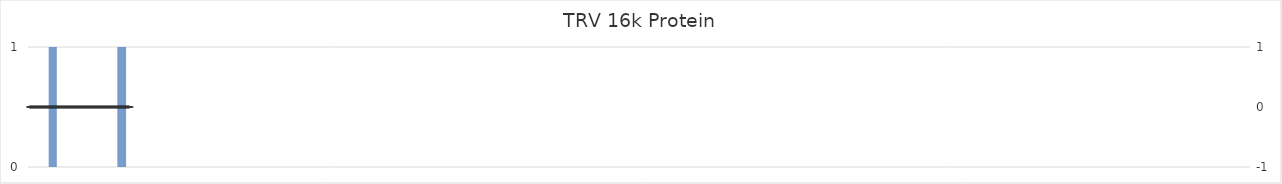
| Category | TRV 16k Protein |
|---|---|
| 1.0 | 0 |
| 2.0 | 0 |
| 3.0 | 0 |
| 4.0 | 0 |
| 5.0 | 0 |
| 6.0 | 0 |
| 7.0 | 0 |
| 8.0 | 0 |
| 9.0 | 0 |
| 10.0 | 0 |
| 11.0 | 0 |
| 12.0 | 0 |
| 13.0 | 0 |
| 14.0 | 0 |
| 15.0 | 0 |
| 16.0 | 0 |
| 17.0 | 0 |
| 18.0 | 0 |
| 19.0 | 0 |
| 20.0 | 0 |
| 21.0 | 0 |
| 22.0 | 0 |
| 23.0 | 0 |
| 24.0 | 0 |
| 25.0 | 0 |
| 26.0 | 0 |
| 27.0 | 0 |
| 28.0 | 0 |
| 29.0 | 0 |
| 30.0 | 1 |
| 31.0 | 1 |
| 32.0 | 1 |
| 33.0 | 1 |
| 34.0 | 1 |
| 35.0 | 1 |
| 36.0 | 1 |
| 37.0 | 1 |
| 38.0 | 1 |
| 39.0 | 1 |
| 40.0 | 1 |
| 41.0 | 0 |
| 42.0 | 0 |
| 43.0 | 0 |
| 44.0 | 0 |
| 45.0 | 0 |
| 46.0 | 0 |
| 47.0 | 0 |
| 48.0 | 0 |
| 49.0 | 0 |
| 50.0 | 0 |
| 51.0 | 0 |
| 52.0 | 0 |
| 53.0 | 0 |
| 54.0 | 0 |
| 55.0 | 0 |
| 56.0 | 0 |
| 57.0 | 0 |
| 58.0 | 0 |
| 59.0 | 0 |
| 60.0 | 0 |
| 61.0 | 0 |
| 62.0 | 0 |
| 63.0 | 0 |
| 64.0 | 0 |
| 65.0 | 0 |
| 66.0 | 0 |
| 67.0 | 0 |
| 68.0 | 0 |
| 69.0 | 0 |
| 70.0 | 0 |
| 71.0 | 0 |
| 72.0 | 0 |
| 73.0 | 0 |
| 74.0 | 0 |
| 75.0 | 0 |
| 76.0 | 0 |
| 77.0 | 0 |
| 78.0 | 0 |
| 79.0 | 0 |
| 80.0 | 0 |
| 81.0 | 0 |
| 82.0 | 0 |
| 83.0 | 0 |
| 84.0 | 0 |
| 85.0 | 0 |
| 86.0 | 0 |
| 87.0 | 0 |
| 88.0 | 0 |
| 89.0 | 0 |
| 90.0 | 0 |
| 91.0 | 0 |
| 92.0 | 0 |
| 93.0 | 0 |
| 94.0 | 0 |
| 95.0 | 0 |
| 96.0 | 0 |
| 97.0 | 0 |
| 98.0 | 0 |
| 99.0 | 0 |
| 100.0 | 0 |
| 101.0 | 0 |
| 102.0 | 0 |
| 103.0 | 0 |
| 104.0 | 0 |
| 105.0 | 0 |
| 106.0 | 0 |
| 107.0 | 0 |
| 108.0 | 0 |
| 109.0 | 0 |
| 110.0 | 0 |
| 111.0 | 0 |
| 112.0 | 0 |
| 113.0 | 0 |
| 114.0 | 0 |
| 115.0 | 0 |
| 116.0 | 0 |
| 117.0 | 0 |
| 118.0 | 0 |
| 119.0 | 0 |
| 120.0 | 0 |
| 121.0 | 0 |
| 122.0 | 0 |
| 123.0 | 0 |
| 124.0 | 0 |
| 125.0 | 0 |
| 126.0 | 1 |
| 127.0 | 1 |
| 128.0 | 1 |
| 129.0 | 1 |
| 130.0 | 1 |
| 131.0 | 1 |
| 132.0 | 1 |
| 133.0 | 1 |
| 134.0 | 1 |
| 135.0 | 1 |
| 136.0 | 1 |
| 137.0 | 1 |
| 138.0 | 0 |
| 139.0 | 0 |
| 140.0 | 0 |
| 141.0 | 0 |
| 142.0 | 0 |
| 143.0 | 0 |
| 144.0 | 0 |
| 145.0 | 0 |
| 146.0 | 0 |
| 147.0 | 0 |
| 148.0 | 0 |
| 149.0 | 0 |
| 150.0 | 0 |
| 151.0 | 0 |
| 152.0 | 0 |
| 153.0 | 0 |
| 154.0 | 0 |
| 155.0 | 0 |
| 156.0 | 0 |
| 157.0 | 0 |
| 158.0 | 0 |
| 159.0 | 0 |
| 160.0 | 0 |
| 161.0 | 0 |
| 162.0 | 0 |
| 163.0 | 0 |
| 164.0 | 0 |
| 165.0 | 0 |
| 166.0 | 0 |
| 167.0 | 0 |
| 168.0 | 0 |
| 169.0 | 0 |
| 170.0 | 0 |
| 171.0 | 0 |
| 172.0 | 0 |
| 173.0 | 0 |
| 174.0 | 0 |
| 175.0 | 0 |
| 176.0 | 0 |
| 177.0 | 0 |
| 178.0 | 0 |
| 179.0 | 0 |
| 180.0 | 0 |
| 181.0 | 0 |
| 182.0 | 0 |
| 183.0 | 0 |
| 184.0 | 0 |
| 185.0 | 0 |
| 186.0 | 0 |
| 187.0 | 0 |
| 188.0 | 0 |
| 189.0 | 0 |
| 190.0 | 0 |
| 191.0 | 0 |
| 192.0 | 0 |
| 193.0 | 0 |
| 194.0 | 0 |
| 195.0 | 0 |
| 196.0 | 0 |
| 197.0 | 0 |
| 198.0 | 0 |
| 199.0 | 0 |
| 200.0 | 0 |
| 201.0 | 0 |
| 202.0 | 0 |
| 203.0 | 0 |
| 204.0 | 0 |
| 205.0 | 0 |
| 206.0 | 0 |
| 207.0 | 0 |
| 208.0 | 0 |
| 209.0 | 0 |
| 210.0 | 0 |
| 211.0 | 0 |
| 212.0 | 0 |
| 213.0 | 0 |
| 214.0 | 0 |
| 215.0 | 0 |
| 216.0 | 0 |
| 217.0 | 0 |
| 218.0 | 0 |
| 219.0 | 0 |
| 220.0 | 0 |
| 221.0 | 0 |
| 222.0 | 0 |
| 223.0 | 0 |
| 224.0 | 0 |
| 225.0 | 0 |
| 226.0 | 0 |
| 227.0 | 0 |
| 228.0 | 0 |
| 229.0 | 0 |
| 230.0 | 0 |
| 231.0 | 0 |
| 232.0 | 0 |
| 233.0 | 0 |
| 234.0 | 0 |
| 235.0 | 0 |
| 236.0 | 0 |
| 237.0 | 0 |
| 238.0 | 0 |
| 239.0 | 0 |
| 240.0 | 0 |
| 241.0 | 0 |
| 242.0 | 0 |
| 243.0 | 0 |
| 244.0 | 0 |
| 245.0 | 0 |
| 246.0 | 0 |
| 247.0 | 0 |
| 248.0 | 0 |
| 249.0 | 0 |
| 250.0 | 0 |
| 251.0 | 0 |
| 252.0 | 0 |
| 253.0 | 0 |
| 254.0 | 0 |
| 255.0 | 0 |
| 256.0 | 0 |
| 257.0 | 0 |
| 258.0 | 0 |
| 259.0 | 0 |
| 260.0 | 0 |
| 261.0 | 0 |
| 262.0 | 0 |
| 263.0 | 0 |
| 264.0 | 0 |
| 265.0 | 0 |
| 266.0 | 0 |
| 267.0 | 0 |
| 268.0 | 0 |
| 269.0 | 0 |
| 270.0 | 0 |
| 271.0 | 0 |
| 272.0 | 0 |
| 273.0 | 0 |
| 274.0 | 0 |
| 275.0 | 0 |
| 276.0 | 0 |
| 277.0 | 0 |
| 278.0 | 0 |
| 279.0 | 0 |
| 280.0 | 0 |
| 281.0 | 0 |
| 282.0 | 0 |
| 283.0 | 0 |
| 284.0 | 0 |
| 285.0 | 0 |
| 286.0 | 0 |
| 287.0 | 0 |
| 288.0 | 0 |
| 289.0 | 0 |
| 290.0 | 0 |
| 291.0 | 0 |
| 292.0 | 0 |
| 293.0 | 0 |
| 294.0 | 0 |
| 295.0 | 0 |
| 296.0 | 0 |
| 297.0 | 0 |
| 298.0 | 0 |
| 299.0 | 0 |
| 300.0 | 0 |
| 301.0 | 0 |
| 302.0 | 0 |
| 303.0 | 0 |
| 304.0 | 0 |
| 305.0 | 0 |
| 306.0 | 0 |
| 307.0 | 0 |
| 308.0 | 0 |
| 309.0 | 0 |
| 310.0 | 0 |
| 311.0 | 0 |
| 312.0 | 0 |
| 313.0 | 0 |
| 314.0 | 0 |
| 315.0 | 0 |
| 316.0 | 0 |
| 317.0 | 0 |
| 318.0 | 0 |
| 319.0 | 0 |
| 320.0 | 0 |
| 321.0 | 0 |
| 322.0 | 0 |
| 323.0 | 0 |
| 324.0 | 0 |
| 325.0 | 0 |
| 326.0 | 0 |
| 327.0 | 0 |
| 328.0 | 0 |
| 329.0 | 0 |
| 330.0 | 0 |
| 331.0 | 0 |
| 332.0 | 0 |
| 333.0 | 0 |
| 334.0 | 0 |
| 335.0 | 0 |
| 336.0 | 0 |
| 337.0 | 0 |
| 338.0 | 0 |
| 339.0 | 0 |
| 340.0 | 0 |
| 341.0 | 0 |
| 342.0 | 0 |
| 343.0 | 0 |
| 344.0 | 0 |
| 345.0 | 0 |
| 346.0 | 0 |
| 347.0 | 0 |
| 348.0 | 0 |
| 349.0 | 0 |
| 350.0 | 0 |
| 351.0 | 0 |
| 352.0 | 0 |
| 353.0 | 0 |
| 354.0 | 0 |
| 355.0 | 0 |
| 356.0 | 0 |
| 357.0 | 0 |
| 358.0 | 0 |
| 359.0 | 0 |
| 360.0 | 0 |
| 361.0 | 0 |
| 362.0 | 0 |
| 363.0 | 0 |
| 364.0 | 0 |
| 365.0 | 0 |
| 366.0 | 0 |
| 367.0 | 0 |
| 368.0 | 0 |
| 369.0 | 0 |
| 370.0 | 0 |
| 371.0 | 0 |
| 372.0 | 0 |
| 373.0 | 0 |
| 374.0 | 0 |
| 375.0 | 0 |
| 376.0 | 0 |
| 377.0 | 0 |
| 378.0 | 0 |
| 379.0 | 0 |
| 380.0 | 0 |
| 381.0 | 0 |
| 382.0 | 0 |
| 383.0 | 0 |
| 384.0 | 0 |
| 385.0 | 0 |
| 386.0 | 0 |
| 387.0 | 0 |
| 388.0 | 0 |
| 389.0 | 0 |
| 390.0 | 0 |
| 391.0 | 0 |
| 392.0 | 0 |
| 393.0 | 0 |
| 394.0 | 0 |
| 395.0 | 0 |
| 396.0 | 0 |
| 397.0 | 0 |
| 398.0 | 0 |
| 399.0 | 0 |
| 400.0 | 0 |
| 401.0 | 0 |
| 402.0 | 0 |
| 403.0 | 0 |
| 404.0 | 0 |
| 405.0 | 0 |
| 406.0 | 0 |
| 407.0 | 0 |
| 408.0 | 0 |
| 409.0 | 0 |
| 410.0 | 0 |
| 411.0 | 0 |
| 412.0 | 0 |
| 413.0 | 0 |
| 414.0 | 0 |
| 415.0 | 0 |
| 416.0 | 0 |
| 417.0 | 0 |
| 418.0 | 0 |
| 419.0 | 0 |
| 420.0 | 0 |
| 421.0 | 0 |
| 422.0 | 0 |
| 423.0 | 0 |
| 424.0 | 0 |
| 425.0 | 0 |
| 426.0 | 0 |
| 427.0 | 0 |
| 428.0 | 0 |
| 429.0 | 0 |
| 430.0 | 0 |
| 431.0 | 0 |
| 432.0 | 0 |
| 433.0 | 0 |
| 434.0 | 0 |
| 435.0 | 0 |
| 436.0 | 0 |
| 437.0 | 0 |
| 438.0 | 0 |
| 439.0 | 0 |
| 440.0 | 0 |
| 441.0 | 0 |
| 442.0 | 0 |
| 443.0 | 0 |
| 444.0 | 0 |
| 445.0 | 0 |
| 446.0 | 0 |
| 447.0 | 0 |
| 448.0 | 0 |
| 449.0 | 0 |
| 450.0 | 0 |
| 451.0 | 0 |
| 452.0 | 0 |
| 453.0 | 0 |
| 454.0 | 0 |
| 455.0 | 0 |
| 456.0 | 0 |
| 457.0 | 0 |
| 458.0 | 0 |
| 459.0 | 0 |
| 460.0 | 0 |
| 461.0 | 0 |
| 462.0 | 0 |
| 463.0 | 0 |
| 464.0 | 0 |
| 465.0 | 0 |
| 466.0 | 0 |
| 467.0 | 0 |
| 468.0 | 0 |
| 469.0 | 0 |
| 470.0 | 0 |
| 471.0 | 0 |
| 472.0 | 0 |
| 473.0 | 0 |
| 474.0 | 0 |
| 475.0 | 0 |
| 476.0 | 0 |
| 477.0 | 0 |
| 478.0 | 0 |
| 479.0 | 0 |
| 480.0 | 0 |
| 481.0 | 0 |
| 482.0 | 0 |
| 483.0 | 0 |
| 484.0 | 0 |
| 485.0 | 0 |
| 486.0 | 0 |
| 487.0 | 0 |
| 488.0 | 0 |
| 489.0 | 0 |
| 490.0 | 0 |
| 491.0 | 0 |
| 492.0 | 0 |
| 493.0 | 0 |
| 494.0 | 0 |
| 495.0 | 0 |
| 496.0 | 0 |
| 497.0 | 0 |
| 498.0 | 0 |
| 499.0 | 0 |
| 500.0 | 0 |
| 501.0 | 0 |
| 502.0 | 0 |
| 503.0 | 0 |
| 504.0 | 0 |
| 505.0 | 0 |
| 506.0 | 0 |
| 507.0 | 0 |
| 508.0 | 0 |
| 509.0 | 0 |
| 510.0 | 0 |
| 511.0 | 0 |
| 512.0 | 0 |
| 513.0 | 0 |
| 514.0 | 0 |
| 515.0 | 0 |
| 516.0 | 0 |
| 517.0 | 0 |
| 518.0 | 0 |
| 519.0 | 0 |
| 520.0 | 0 |
| 521.0 | 0 |
| 522.0 | 0 |
| 523.0 | 0 |
| 524.0 | 0 |
| 525.0 | 0 |
| 526.0 | 0 |
| 527.0 | 0 |
| 528.0 | 0 |
| 529.0 | 0 |
| 530.0 | 0 |
| 531.0 | 0 |
| 532.0 | 0 |
| 533.0 | 0 |
| 534.0 | 0 |
| 535.0 | 0 |
| 536.0 | 0 |
| 537.0 | 0 |
| 538.0 | 0 |
| 539.0 | 0 |
| 540.0 | 0 |
| 541.0 | 0 |
| 542.0 | 0 |
| 543.0 | 0 |
| 544.0 | 0 |
| 545.0 | 0 |
| 546.0 | 0 |
| 547.0 | 0 |
| 548.0 | 0 |
| 549.0 | 0 |
| 550.0 | 0 |
| 551.0 | 0 |
| 552.0 | 0 |
| 553.0 | 0 |
| 554.0 | 0 |
| 555.0 | 0 |
| 556.0 | 0 |
| 557.0 | 0 |
| 558.0 | 0 |
| 559.0 | 0 |
| 560.0 | 0 |
| 561.0 | 0 |
| 562.0 | 0 |
| 563.0 | 0 |
| 564.0 | 0 |
| 565.0 | 0 |
| 566.0 | 0 |
| 567.0 | 0 |
| 568.0 | 0 |
| 569.0 | 0 |
| 570.0 | 0 |
| 571.0 | 0 |
| 572.0 | 0 |
| 573.0 | 0 |
| 574.0 | 0 |
| 575.0 | 0 |
| 576.0 | 0 |
| 577.0 | 0 |
| 578.0 | 0 |
| 579.0 | 0 |
| 580.0 | 0 |
| 581.0 | 0 |
| 582.0 | 0 |
| 583.0 | 0 |
| 584.0 | 0 |
| 585.0 | 0 |
| 586.0 | 0 |
| 587.0 | 0 |
| 588.0 | 0 |
| 589.0 | 0 |
| 590.0 | 0 |
| 591.0 | 0 |
| 592.0 | 0 |
| 593.0 | 0 |
| 594.0 | 0 |
| 595.0 | 0 |
| 596.0 | 0 |
| 597.0 | 0 |
| 598.0 | 0 |
| 599.0 | 0 |
| 600.0 | 0 |
| 601.0 | 0 |
| 602.0 | 0 |
| 603.0 | 0 |
| 604.0 | 0 |
| 605.0 | 0 |
| 606.0 | 0 |
| 607.0 | 0 |
| 608.0 | 0 |
| 609.0 | 0 |
| 610.0 | 0 |
| 611.0 | 0 |
| 612.0 | 0 |
| 613.0 | 0 |
| 614.0 | 0 |
| 615.0 | 0 |
| 616.0 | 0 |
| 617.0 | 0 |
| 618.0 | 0 |
| 619.0 | 0 |
| 620.0 | 0 |
| 621.0 | 0 |
| 622.0 | 0 |
| 623.0 | 0 |
| 624.0 | 0 |
| 625.0 | 0 |
| 626.0 | 0 |
| 627.0 | 0 |
| 628.0 | 0 |
| 629.0 | 0 |
| 630.0 | 0 |
| 631.0 | 0 |
| 632.0 | 0 |
| 633.0 | 0 |
| 634.0 | 0 |
| 635.0 | 0 |
| 636.0 | 0 |
| 637.0 | 0 |
| 638.0 | 0 |
| 639.0 | 0 |
| 640.0 | 0 |
| 641.0 | 0 |
| 642.0 | 0 |
| 643.0 | 0 |
| 644.0 | 0 |
| 645.0 | 0 |
| 646.0 | 0 |
| 647.0 | 0 |
| 648.0 | 0 |
| 649.0 | 0 |
| 650.0 | 0 |
| 651.0 | 0 |
| 652.0 | 0 |
| 653.0 | 0 |
| 654.0 | 0 |
| 655.0 | 0 |
| 656.0 | 0 |
| 657.0 | 0 |
| 658.0 | 0 |
| 659.0 | 0 |
| 660.0 | 0 |
| 661.0 | 0 |
| 662.0 | 0 |
| 663.0 | 0 |
| 664.0 | 0 |
| 665.0 | 0 |
| 666.0 | 0 |
| 667.0 | 0 |
| 668.0 | 0 |
| 669.0 | 0 |
| 670.0 | 0 |
| 671.0 | 0 |
| 672.0 | 0 |
| 673.0 | 0 |
| 674.0 | 0 |
| 675.0 | 0 |
| 676.0 | 0 |
| 677.0 | 0 |
| 678.0 | 0 |
| 679.0 | 0 |
| 680.0 | 0 |
| 681.0 | 0 |
| 682.0 | 0 |
| 683.0 | 0 |
| 684.0 | 0 |
| 685.0 | 0 |
| 686.0 | 0 |
| 687.0 | 0 |
| 688.0 | 0 |
| 689.0 | 0 |
| 690.0 | 0 |
| 691.0 | 0 |
| 692.0 | 0 |
| 693.0 | 0 |
| 694.0 | 0 |
| 695.0 | 0 |
| 696.0 | 0 |
| 697.0 | 0 |
| 698.0 | 0 |
| 699.0 | 0 |
| 700.0 | 0 |
| 701.0 | 0 |
| 702.0 | 0 |
| 703.0 | 0 |
| 704.0 | 0 |
| 705.0 | 0 |
| 706.0 | 0 |
| 707.0 | 0 |
| 708.0 | 0 |
| 709.0 | 0 |
| 710.0 | 0 |
| 711.0 | 0 |
| 712.0 | 0 |
| 713.0 | 0 |
| 714.0 | 0 |
| 715.0 | 0 |
| 716.0 | 0 |
| 717.0 | 0 |
| 718.0 | 0 |
| 719.0 | 0 |
| 720.0 | 0 |
| 721.0 | 0 |
| 722.0 | 0 |
| 723.0 | 0 |
| 724.0 | 0 |
| 725.0 | 0 |
| 726.0 | 0 |
| 727.0 | 0 |
| 728.0 | 0 |
| 729.0 | 0 |
| 730.0 | 0 |
| 731.0 | 0 |
| 732.0 | 0 |
| 733.0 | 0 |
| 734.0 | 0 |
| 735.0 | 0 |
| 736.0 | 0 |
| 737.0 | 0 |
| 738.0 | 0 |
| 739.0 | 0 |
| 740.0 | 0 |
| 741.0 | 0 |
| 742.0 | 0 |
| 743.0 | 0 |
| 744.0 | 0 |
| 745.0 | 0 |
| 746.0 | 0 |
| 747.0 | 0 |
| 748.0 | 0 |
| 749.0 | 0 |
| 750.0 | 0 |
| 751.0 | 0 |
| 752.0 | 0 |
| 753.0 | 0 |
| 754.0 | 0 |
| 755.0 | 0 |
| 756.0 | 0 |
| 757.0 | 0 |
| 758.0 | 0 |
| 759.0 | 0 |
| 760.0 | 0 |
| 761.0 | 0 |
| 762.0 | 0 |
| 763.0 | 0 |
| 764.0 | 0 |
| 765.0 | 0 |
| 766.0 | 0 |
| 767.0 | 0 |
| 768.0 | 0 |
| 769.0 | 0 |
| 770.0 | 0 |
| 771.0 | 0 |
| 772.0 | 0 |
| 773.0 | 0 |
| 774.0 | 0 |
| 775.0 | 0 |
| 776.0 | 0 |
| 777.0 | 0 |
| 778.0 | 0 |
| 779.0 | 0 |
| 780.0 | 0 |
| 781.0 | 0 |
| 782.0 | 0 |
| 783.0 | 0 |
| 784.0 | 0 |
| 785.0 | 0 |
| 786.0 | 0 |
| 787.0 | 0 |
| 788.0 | 0 |
| 789.0 | 0 |
| 790.0 | 0 |
| 791.0 | 0 |
| 792.0 | 0 |
| 793.0 | 0 |
| 794.0 | 0 |
| 795.0 | 0 |
| 796.0 | 0 |
| 797.0 | 0 |
| 798.0 | 0 |
| 799.0 | 0 |
| 800.0 | 0 |
| 801.0 | 0 |
| 802.0 | 0 |
| 803.0 | 0 |
| 804.0 | 0 |
| 805.0 | 0 |
| 806.0 | 0 |
| 807.0 | 0 |
| 808.0 | 0 |
| 809.0 | 0 |
| 810.0 | 0 |
| 811.0 | 0 |
| 812.0 | 0 |
| 813.0 | 0 |
| 814.0 | 0 |
| 815.0 | 0 |
| 816.0 | 0 |
| 817.0 | 0 |
| 818.0 | 0 |
| 819.0 | 0 |
| 820.0 | 0 |
| 821.0 | 0 |
| 822.0 | 0 |
| 823.0 | 0 |
| 824.0 | 0 |
| 825.0 | 0 |
| 826.0 | 0 |
| 827.0 | 0 |
| 828.0 | 0 |
| 829.0 | 0 |
| 830.0 | 0 |
| 831.0 | 0 |
| 832.0 | 0 |
| 833.0 | 0 |
| 834.0 | 0 |
| 835.0 | 0 |
| 836.0 | 0 |
| 837.0 | 0 |
| 838.0 | 0 |
| 839.0 | 0 |
| 840.0 | 0 |
| 841.0 | 0 |
| 842.0 | 0 |
| 843.0 | 0 |
| 844.0 | 0 |
| 845.0 | 0 |
| 846.0 | 0 |
| 847.0 | 0 |
| 848.0 | 0 |
| 849.0 | 0 |
| 850.0 | 0 |
| 851.0 | 0 |
| 852.0 | 0 |
| 853.0 | 0 |
| 854.0 | 0 |
| 855.0 | 0 |
| 856.0 | 0 |
| 857.0 | 0 |
| 858.0 | 0 |
| 859.0 | 0 |
| 860.0 | 0 |
| 861.0 | 0 |
| 862.0 | 0 |
| 863.0 | 0 |
| 864.0 | 0 |
| 865.0 | 0 |
| 866.0 | 0 |
| 867.0 | 0 |
| 868.0 | 0 |
| 869.0 | 0 |
| 870.0 | 0 |
| 871.0 | 0 |
| 872.0 | 0 |
| 873.0 | 0 |
| 874.0 | 0 |
| 875.0 | 0 |
| 876.0 | 0 |
| 877.0 | 0 |
| 878.0 | 0 |
| 879.0 | 0 |
| 880.0 | 0 |
| 881.0 | 0 |
| 882.0 | 0 |
| 883.0 | 0 |
| 884.0 | 0 |
| 885.0 | 0 |
| 886.0 | 0 |
| 887.0 | 0 |
| 888.0 | 0 |
| 889.0 | 0 |
| 890.0 | 0 |
| 891.0 | 0 |
| 892.0 | 0 |
| 893.0 | 0 |
| 894.0 | 0 |
| 895.0 | 0 |
| 896.0 | 0 |
| 897.0 | 0 |
| 898.0 | 0 |
| 899.0 | 0 |
| 900.0 | 0 |
| 901.0 | 0 |
| 902.0 | 0 |
| 903.0 | 0 |
| 904.0 | 0 |
| 905.0 | 0 |
| 906.0 | 0 |
| 907.0 | 0 |
| 908.0 | 0 |
| 909.0 | 0 |
| 910.0 | 0 |
| 911.0 | 0 |
| 912.0 | 0 |
| 913.0 | 0 |
| 914.0 | 0 |
| 915.0 | 0 |
| 916.0 | 0 |
| 917.0 | 0 |
| 918.0 | 0 |
| 919.0 | 0 |
| 920.0 | 0 |
| 921.0 | 0 |
| 922.0 | 0 |
| 923.0 | 0 |
| 924.0 | 0 |
| 925.0 | 0 |
| 926.0 | 0 |
| 927.0 | 0 |
| 928.0 | 0 |
| 929.0 | 0 |
| 930.0 | 0 |
| 931.0 | 0 |
| 932.0 | 0 |
| 933.0 | 0 |
| 934.0 | 0 |
| 935.0 | 0 |
| 936.0 | 0 |
| 937.0 | 0 |
| 938.0 | 0 |
| 939.0 | 0 |
| 940.0 | 0 |
| 941.0 | 0 |
| 942.0 | 0 |
| 943.0 | 0 |
| 944.0 | 0 |
| 945.0 | 0 |
| 946.0 | 0 |
| 947.0 | 0 |
| 948.0 | 0 |
| 949.0 | 0 |
| 950.0 | 0 |
| 951.0 | 0 |
| 952.0 | 0 |
| 953.0 | 0 |
| 954.0 | 0 |
| 955.0 | 0 |
| 956.0 | 0 |
| 957.0 | 0 |
| 958.0 | 0 |
| 959.0 | 0 |
| 960.0 | 0 |
| 961.0 | 0 |
| 962.0 | 0 |
| 963.0 | 0 |
| 964.0 | 0 |
| 965.0 | 0 |
| 966.0 | 0 |
| 967.0 | 0 |
| 968.0 | 0 |
| 969.0 | 0 |
| 970.0 | 0 |
| 971.0 | 0 |
| 972.0 | 0 |
| 973.0 | 0 |
| 974.0 | 0 |
| 975.0 | 0 |
| 976.0 | 0 |
| 977.0 | 0 |
| 978.0 | 0 |
| 979.0 | 0 |
| 980.0 | 0 |
| 981.0 | 0 |
| 982.0 | 0 |
| 983.0 | 0 |
| 984.0 | 0 |
| 985.0 | 0 |
| 986.0 | 0 |
| 987.0 | 0 |
| 988.0 | 0 |
| 989.0 | 0 |
| 990.0 | 0 |
| 991.0 | 0 |
| 992.0 | 0 |
| 993.0 | 0 |
| 994.0 | 0 |
| 995.0 | 0 |
| 996.0 | 0 |
| 997.0 | 0 |
| 998.0 | 0 |
| 999.0 | 0 |
| 1000.0 | 0 |
| 1001.0 | 0 |
| 1002.0 | 0 |
| 1003.0 | 0 |
| 1004.0 | 0 |
| 1005.0 | 0 |
| 1006.0 | 0 |
| 1007.0 | 0 |
| 1008.0 | 0 |
| 1009.0 | 0 |
| 1010.0 | 0 |
| 1011.0 | 0 |
| 1012.0 | 0 |
| 1013.0 | 0 |
| 1014.0 | 0 |
| 1015.0 | 0 |
| 1016.0 | 0 |
| 1017.0 | 0 |
| 1018.0 | 0 |
| 1019.0 | 0 |
| 1020.0 | 0 |
| 1021.0 | 0 |
| 1022.0 | 0 |
| 1023.0 | 0 |
| 1024.0 | 0 |
| 1025.0 | 0 |
| 1026.0 | 0 |
| 1027.0 | 0 |
| 1028.0 | 0 |
| 1029.0 | 0 |
| 1030.0 | 0 |
| 1031.0 | 0 |
| 1032.0 | 0 |
| 1033.0 | 0 |
| 1034.0 | 0 |
| 1035.0 | 0 |
| 1036.0 | 0 |
| 1037.0 | 0 |
| 1038.0 | 0 |
| 1039.0 | 0 |
| 1040.0 | 0 |
| 1041.0 | 0 |
| 1042.0 | 0 |
| 1043.0 | 0 |
| 1044.0 | 0 |
| 1045.0 | 0 |
| 1046.0 | 0 |
| 1047.0 | 0 |
| 1048.0 | 0 |
| 1049.0 | 0 |
| 1050.0 | 0 |
| 1051.0 | 0 |
| 1052.0 | 0 |
| 1053.0 | 0 |
| 1054.0 | 0 |
| 1055.0 | 0 |
| 1056.0 | 0 |
| 1057.0 | 0 |
| 1058.0 | 0 |
| 1059.0 | 0 |
| 1060.0 | 0 |
| 1061.0 | 0 |
| 1062.0 | 0 |
| 1063.0 | 0 |
| 1064.0 | 0 |
| 1065.0 | 0 |
| 1066.0 | 0 |
| 1067.0 | 0 |
| 1068.0 | 0 |
| 1069.0 | 0 |
| 1070.0 | 0 |
| 1071.0 | 0 |
| 1072.0 | 0 |
| 1073.0 | 0 |
| 1074.0 | 0 |
| 1075.0 | 0 |
| 1076.0 | 0 |
| 1077.0 | 0 |
| 1078.0 | 0 |
| 1079.0 | 0 |
| 1080.0 | 0 |
| 1081.0 | 0 |
| 1082.0 | 0 |
| 1083.0 | 0 |
| 1084.0 | 0 |
| 1085.0 | 0 |
| 1086.0 | 0 |
| 1087.0 | 0 |
| 1088.0 | 0 |
| 1089.0 | 0 |
| 1090.0 | 0 |
| 1091.0 | 0 |
| 1092.0 | 0 |
| 1093.0 | 0 |
| 1094.0 | 0 |
| 1095.0 | 0 |
| 1096.0 | 0 |
| 1097.0 | 0 |
| 1098.0 | 0 |
| 1099.0 | 0 |
| 1100.0 | 0 |
| 1101.0 | 0 |
| 1102.0 | 0 |
| 1103.0 | 0 |
| 1104.0 | 0 |
| 1105.0 | 0 |
| 1106.0 | 0 |
| 1107.0 | 0 |
| 1108.0 | 0 |
| 1109.0 | 0 |
| 1110.0 | 0 |
| 1111.0 | 0 |
| 1112.0 | 0 |
| 1113.0 | 0 |
| 1114.0 | 0 |
| 1115.0 | 0 |
| 1116.0 | 0 |
| 1117.0 | 0 |
| 1118.0 | 0 |
| 1119.0 | 0 |
| 1120.0 | 0 |
| 1121.0 | 0 |
| 1122.0 | 0 |
| 1123.0 | 0 |
| 1124.0 | 0 |
| 1125.0 | 0 |
| 1126.0 | 0 |
| 1127.0 | 0 |
| 1128.0 | 0 |
| 1129.0 | 0 |
| 1130.0 | 0 |
| 1131.0 | 0 |
| 1132.0 | 0 |
| 1133.0 | 0 |
| 1134.0 | 0 |
| 1135.0 | 0 |
| 1136.0 | 0 |
| 1137.0 | 0 |
| 1138.0 | 0 |
| 1139.0 | 0 |
| 1140.0 | 0 |
| 1141.0 | 0 |
| 1142.0 | 0 |
| 1143.0 | 0 |
| 1144.0 | 0 |
| 1145.0 | 0 |
| 1146.0 | 0 |
| 1147.0 | 0 |
| 1148.0 | 0 |
| 1149.0 | 0 |
| 1150.0 | 0 |
| 1151.0 | 0 |
| 1152.0 | 0 |
| 1153.0 | 0 |
| 1154.0 | 0 |
| 1155.0 | 0 |
| 1156.0 | 0 |
| 1157.0 | 0 |
| 1158.0 | 0 |
| 1159.0 | 0 |
| 1160.0 | 0 |
| 1161.0 | 0 |
| 1162.0 | 0 |
| 1163.0 | 0 |
| 1164.0 | 0 |
| 1165.0 | 0 |
| 1166.0 | 0 |
| 1167.0 | 0 |
| 1168.0 | 0 |
| 1169.0 | 0 |
| 1170.0 | 0 |
| 1171.0 | 0 |
| 1172.0 | 0 |
| 1173.0 | 0 |
| 1174.0 | 0 |
| 1175.0 | 0 |
| 1176.0 | 0 |
| 1177.0 | 0 |
| 1178.0 | 0 |
| 1179.0 | 0 |
| 1180.0 | 0 |
| 1181.0 | 0 |
| 1182.0 | 0 |
| 1183.0 | 0 |
| 1184.0 | 0 |
| 1185.0 | 0 |
| 1186.0 | 0 |
| 1187.0 | 0 |
| 1188.0 | 0 |
| 1189.0 | 0 |
| 1190.0 | 0 |
| 1191.0 | 0 |
| 1192.0 | 0 |
| 1193.0 | 0 |
| 1194.0 | 0 |
| 1195.0 | 0 |
| 1196.0 | 0 |
| 1197.0 | 0 |
| 1198.0 | 0 |
| 1199.0 | 0 |
| 1200.0 | 0 |
| 1201.0 | 0 |
| 1202.0 | 0 |
| 1203.0 | 0 |
| 1204.0 | 0 |
| 1205.0 | 0 |
| 1206.0 | 0 |
| 1207.0 | 0 |
| 1208.0 | 0 |
| 1209.0 | 0 |
| 1210.0 | 0 |
| 1211.0 | 0 |
| 1212.0 | 0 |
| 1213.0 | 0 |
| 1214.0 | 0 |
| 1215.0 | 0 |
| 1216.0 | 0 |
| 1217.0 | 0 |
| 1218.0 | 0 |
| 1219.0 | 0 |
| 1220.0 | 0 |
| 1221.0 | 0 |
| 1222.0 | 0 |
| 1223.0 | 0 |
| 1224.0 | 0 |
| 1225.0 | 0 |
| 1226.0 | 0 |
| 1227.0 | 0 |
| 1228.0 | 0 |
| 1229.0 | 0 |
| 1230.0 | 0 |
| 1231.0 | 0 |
| 1232.0 | 0 |
| 1233.0 | 0 |
| 1234.0 | 0 |
| 1235.0 | 0 |
| 1236.0 | 0 |
| 1237.0 | 0 |
| 1238.0 | 0 |
| 1239.0 | 0 |
| 1240.0 | 0 |
| 1241.0 | 0 |
| 1242.0 | 0 |
| 1243.0 | 0 |
| 1244.0 | 0 |
| 1245.0 | 0 |
| 1246.0 | 0 |
| 1247.0 | 0 |
| 1248.0 | 0 |
| 1249.0 | 0 |
| 1250.0 | 0 |
| 1251.0 | 0 |
| 1252.0 | 0 |
| 1253.0 | 0 |
| 1254.0 | 0 |
| 1255.0 | 0 |
| 1256.0 | 0 |
| 1257.0 | 0 |
| 1258.0 | 0 |
| 1259.0 | 0 |
| 1260.0 | 0 |
| 1261.0 | 0 |
| 1262.0 | 0 |
| 1263.0 | 0 |
| 1264.0 | 0 |
| 1265.0 | 0 |
| 1266.0 | 0 |
| 1267.0 | 0 |
| 1268.0 | 0 |
| 1269.0 | 0 |
| 1270.0 | 0 |
| 1271.0 | 0 |
| 1272.0 | 0 |
| 1273.0 | 0 |
| 1274.0 | 0 |
| 1275.0 | 0 |
| 1276.0 | 0 |
| 1277.0 | 0 |
| 1278.0 | 0 |
| 1279.0 | 0 |
| 1280.0 | 0 |
| 1281.0 | 0 |
| 1282.0 | 0 |
| 1283.0 | 0 |
| 1284.0 | 0 |
| 1285.0 | 0 |
| 1286.0 | 0 |
| 1287.0 | 0 |
| 1288.0 | 0 |
| 1289.0 | 0 |
| 1290.0 | 0 |
| 1291.0 | 0 |
| 1292.0 | 0 |
| 1293.0 | 0 |
| 1294.0 | 0 |
| 1295.0 | 0 |
| 1296.0 | 0 |
| 1297.0 | 0 |
| 1298.0 | 0 |
| 1299.0 | 0 |
| 1300.0 | 0 |
| 1301.0 | 0 |
| 1302.0 | 0 |
| 1303.0 | 0 |
| 1304.0 | 0 |
| 1305.0 | 0 |
| 1306.0 | 0 |
| 1307.0 | 0 |
| 1308.0 | 0 |
| 1309.0 | 0 |
| 1310.0 | 0 |
| 1311.0 | 0 |
| 1312.0 | 0 |
| 1313.0 | 0 |
| 1314.0 | 0 |
| 1315.0 | 0 |
| 1316.0 | 0 |
| 1317.0 | 0 |
| 1318.0 | 0 |
| 1319.0 | 0 |
| 1320.0 | 0 |
| 1321.0 | 0 |
| 1322.0 | 0 |
| 1323.0 | 0 |
| 1324.0 | 0 |
| 1325.0 | 0 |
| 1326.0 | 0 |
| 1327.0 | 0 |
| 1328.0 | 0 |
| 1329.0 | 0 |
| 1330.0 | 0 |
| 1331.0 | 0 |
| 1332.0 | 0 |
| 1333.0 | 0 |
| 1334.0 | 0 |
| 1335.0 | 0 |
| 1336.0 | 0 |
| 1337.0 | 0 |
| 1338.0 | 0 |
| 1339.0 | 0 |
| 1340.0 | 0 |
| 1341.0 | 0 |
| 1342.0 | 0 |
| 1343.0 | 0 |
| 1344.0 | 0 |
| 1345.0 | 0 |
| 1346.0 | 0 |
| 1347.0 | 0 |
| 1348.0 | 0 |
| 1349.0 | 0 |
| 1350.0 | 0 |
| 1351.0 | 0 |
| 1352.0 | 0 |
| 1353.0 | 0 |
| 1354.0 | 0 |
| 1355.0 | 0 |
| 1356.0 | 0 |
| 1357.0 | 0 |
| 1358.0 | 0 |
| 1359.0 | 0 |
| 1360.0 | 0 |
| 1361.0 | 0 |
| 1362.0 | 0 |
| 1363.0 | 0 |
| 1364.0 | 0 |
| 1365.0 | 0 |
| 1366.0 | 0 |
| 1367.0 | 0 |
| 1368.0 | 0 |
| 1369.0 | 0 |
| 1370.0 | 0 |
| 1371.0 | 0 |
| 1372.0 | 0 |
| 1373.0 | 0 |
| 1374.0 | 0 |
| 1375.0 | 0 |
| 1376.0 | 0 |
| 1377.0 | 0 |
| 1378.0 | 0 |
| 1379.0 | 0 |
| 1380.0 | 0 |
| 1381.0 | 0 |
| 1382.0 | 0 |
| 1383.0 | 0 |
| 1384.0 | 0 |
| 1385.0 | 0 |
| 1386.0 | 0 |
| 1387.0 | 0 |
| 1388.0 | 0 |
| 1389.0 | 0 |
| 1390.0 | 0 |
| 1391.0 | 0 |
| 1392.0 | 0 |
| 1393.0 | 0 |
| 1394.0 | 0 |
| 1395.0 | 0 |
| 1396.0 | 0 |
| 1397.0 | 0 |
| 1398.0 | 0 |
| 1399.0 | 0 |
| 1400.0 | 0 |
| 1401.0 | 0 |
| 1402.0 | 0 |
| 1403.0 | 0 |
| 1404.0 | 0 |
| 1405.0 | 0 |
| 1406.0 | 0 |
| 1407.0 | 0 |
| 1408.0 | 0 |
| 1409.0 | 0 |
| 1410.0 | 0 |
| 1411.0 | 0 |
| 1412.0 | 0 |
| 1413.0 | 0 |
| 1414.0 | 0 |
| 1415.0 | 0 |
| 1416.0 | 0 |
| 1417.0 | 0 |
| 1418.0 | 0 |
| 1419.0 | 0 |
| 1420.0 | 0 |
| 1421.0 | 0 |
| 1422.0 | 0 |
| 1423.0 | 0 |
| 1424.0 | 0 |
| 1425.0 | 0 |
| 1426.0 | 0 |
| 1427.0 | 0 |
| 1428.0 | 0 |
| 1429.0 | 0 |
| 1430.0 | 0 |
| 1431.0 | 0 |
| 1432.0 | 0 |
| 1433.0 | 0 |
| 1434.0 | 0 |
| 1435.0 | 0 |
| 1436.0 | 0 |
| 1437.0 | 0 |
| 1438.0 | 0 |
| 1439.0 | 0 |
| 1440.0 | 0 |
| 1441.0 | 0 |
| 1442.0 | 0 |
| 1443.0 | 0 |
| 1444.0 | 0 |
| 1445.0 | 0 |
| 1446.0 | 0 |
| 1447.0 | 0 |
| 1448.0 | 0 |
| 1449.0 | 0 |
| 1450.0 | 0 |
| 1451.0 | 0 |
| 1452.0 | 0 |
| 1453.0 | 0 |
| 1454.0 | 0 |
| 1455.0 | 0 |
| 1456.0 | 0 |
| 1457.0 | 0 |
| 1458.0 | 0 |
| 1459.0 | 0 |
| 1460.0 | 0 |
| 1461.0 | 0 |
| 1462.0 | 0 |
| 1463.0 | 0 |
| 1464.0 | 0 |
| 1465.0 | 0 |
| 1466.0 | 0 |
| 1467.0 | 0 |
| 1468.0 | 0 |
| 1469.0 | 0 |
| 1470.0 | 0 |
| 1471.0 | 0 |
| 1472.0 | 0 |
| 1473.0 | 0 |
| 1474.0 | 0 |
| 1475.0 | 0 |
| 1476.0 | 0 |
| 1477.0 | 0 |
| 1478.0 | 0 |
| 1479.0 | 0 |
| 1480.0 | 0 |
| 1481.0 | 0 |
| 1482.0 | 0 |
| 1483.0 | 0 |
| 1484.0 | 0 |
| 1485.0 | 0 |
| 1486.0 | 0 |
| 1487.0 | 0 |
| 1488.0 | 0 |
| 1489.0 | 0 |
| 1490.0 | 0 |
| 1491.0 | 0 |
| 1492.0 | 0 |
| 1493.0 | 0 |
| 1494.0 | 0 |
| 1495.0 | 0 |
| 1496.0 | 0 |
| 1497.0 | 0 |
| 1498.0 | 0 |
| 1499.0 | 0 |
| 1500.0 | 0 |
| 1501.0 | 0 |
| 1502.0 | 0 |
| 1503.0 | 0 |
| 1504.0 | 0 |
| 1505.0 | 0 |
| 1506.0 | 0 |
| 1507.0 | 0 |
| 1508.0 | 0 |
| 1509.0 | 0 |
| 1510.0 | 0 |
| 1511.0 | 0 |
| 1512.0 | 0 |
| 1513.0 | 0 |
| 1514.0 | 0 |
| 1515.0 | 0 |
| 1516.0 | 0 |
| 1517.0 | 0 |
| 1518.0 | 0 |
| 1519.0 | 0 |
| 1520.0 | 0 |
| 1521.0 | 0 |
| 1522.0 | 0 |
| 1523.0 | 0 |
| 1524.0 | 0 |
| 1525.0 | 0 |
| 1526.0 | 0 |
| 1527.0 | 0 |
| 1528.0 | 0 |
| 1529.0 | 0 |
| 1530.0 | 0 |
| 1531.0 | 0 |
| 1532.0 | 0 |
| 1533.0 | 0 |
| 1534.0 | 0 |
| 1535.0 | 0 |
| 1536.0 | 0 |
| 1537.0 | 0 |
| 1538.0 | 0 |
| 1539.0 | 0 |
| 1540.0 | 0 |
| 1541.0 | 0 |
| 1542.0 | 0 |
| 1543.0 | 0 |
| 1544.0 | 0 |
| 1545.0 | 0 |
| 1546.0 | 0 |
| 1547.0 | 0 |
| 1548.0 | 0 |
| 1549.0 | 0 |
| 1550.0 | 0 |
| 1551.0 | 0 |
| 1552.0 | 0 |
| 1553.0 | 0 |
| 1554.0 | 0 |
| 1555.0 | 0 |
| 1556.0 | 0 |
| 1557.0 | 0 |
| 1558.0 | 0 |
| 1559.0 | 0 |
| 1560.0 | 0 |
| 1561.0 | 0 |
| 1562.0 | 0 |
| 1563.0 | 0 |
| 1564.0 | 0 |
| 1565.0 | 0 |
| 1566.0 | 0 |
| 1567.0 | 0 |
| 1568.0 | 0 |
| 1569.0 | 0 |
| 1570.0 | 0 |
| 1571.0 | 0 |
| 1572.0 | 0 |
| 1573.0 | 0 |
| 1574.0 | 0 |
| 1575.0 | 0 |
| 1576.0 | 0 |
| 1577.0 | 0 |
| 1578.0 | 0 |
| 1579.0 | 0 |
| 1580.0 | 0 |
| 1581.0 | 0 |
| 1582.0 | 0 |
| 1583.0 | 0 |
| 1584.0 | 0 |
| 1585.0 | 0 |
| 1586.0 | 0 |
| 1587.0 | 0 |
| 1588.0 | 0 |
| 1589.0 | 0 |
| 1590.0 | 0 |
| 1591.0 | 0 |
| 1592.0 | 0 |
| 1593.0 | 0 |
| 1594.0 | 0 |
| 1595.0 | 0 |
| 1596.0 | 0 |
| 1597.0 | 0 |
| 1598.0 | 0 |
| 1599.0 | 0 |
| 1600.0 | 0 |
| 1601.0 | 0 |
| 1602.0 | 0 |
| 1603.0 | 0 |
| 1604.0 | 0 |
| 1605.0 | 0 |
| 1606.0 | 0 |
| 1607.0 | 0 |
| 1608.0 | 0 |
| 1609.0 | 0 |
| 1610.0 | 0 |
| 1611.0 | 0 |
| 1612.0 | 0 |
| 1613.0 | 0 |
| 1614.0 | 0 |
| 1615.0 | 0 |
| 1616.0 | 0 |
| 1617.0 | 0 |
| 1618.0 | 0 |
| 1619.0 | 0 |
| 1620.0 | 0 |
| 1621.0 | 0 |
| 1622.0 | 0 |
| 1623.0 | 0 |
| 1624.0 | 0 |
| 1625.0 | 0 |
| 1626.0 | 0 |
| 1627.0 | 0 |
| 1628.0 | 0 |
| 1629.0 | 0 |
| 1630.0 | 0 |
| 1631.0 | 0 |
| 1632.0 | 0 |
| 1633.0 | 0 |
| 1634.0 | 0 |
| 1635.0 | 0 |
| 1636.0 | 0 |
| 1637.0 | 0 |
| 1638.0 | 0 |
| 1639.0 | 0 |
| 1640.0 | 0 |
| 1641.0 | 0 |
| 1642.0 | 0 |
| 1643.0 | 0 |
| 1644.0 | 0 |
| 1645.0 | 0 |
| 1646.0 | 0 |
| 1647.0 | 0 |
| 1648.0 | 0 |
| 1649.0 | 0 |
| 1650.0 | 0 |
| 1651.0 | 0 |
| 1652.0 | 0 |
| 1653.0 | 0 |
| 1654.0 | 0 |
| 1655.0 | 0 |
| 1656.0 | 0 |
| 1657.0 | 0 |
| 1658.0 | 0 |
| 1659.0 | 0 |
| 1660.0 | 0 |
| 1661.0 | 0 |
| 1662.0 | 0 |
| 1663.0 | 0 |
| 1664.0 | 0 |
| 1665.0 | 0 |
| 1666.0 | 0 |
| 1667.0 | 0 |
| 1668.0 | 0 |
| 1669.0 | 0 |
| 1670.0 | 0 |
| 1671.0 | 0 |
| 1672.0 | 0 |
| 1673.0 | 0 |
| 1674.0 | 0 |
| 1675.0 | 0 |
| 1676.0 | 0 |
| 1677.0 | 0 |
| 1678.0 | 0 |
| 1679.0 | 0 |
| 1680.0 | 0 |
| 1681.0 | 0 |
| 1682.0 | 0 |
| 1683.0 | 0 |
| 1684.0 | 0 |
| 1685.0 | 0 |
| 1686.0 | 0 |
| 1687.0 | 0 |
| 1688.0 | 0 |
| 1689.0 | 0 |
| 1690.0 | 0 |
| 1691.0 | 0 |
| 1692.0 | 0 |
| 1693.0 | 0 |
| 1694.0 | 0 |
| 1695.0 | 0 |
| 1696.0 | 0 |
| 1697.0 | 0 |
| 1698.0 | 0 |
| 1699.0 | 0 |
| 1700.0 | 0 |
| 1701.0 | 0 |
| 1702.0 | 0 |
| 1703.0 | 0 |
| 1704.0 | 0 |
| 1705.0 | 0 |
| 1706.0 | 0 |
| 1707.0 | 0 |